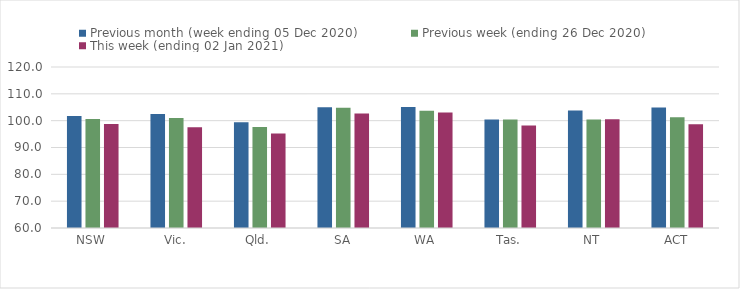
| Category | Previous month (week ending 05 Dec 2020) | Previous week (ending 26 Dec 2020) | This week (ending 02 Jan 2021) |
|---|---|---|---|
| NSW | 101.77 | 100.63 | 98.73 |
| Vic. | 102.46 | 100.96 | 97.59 |
| Qld. | 99.43 | 97.64 | 95.25 |
| SA | 104.97 | 104.85 | 102.71 |
| WA | 105.07 | 103.68 | 103.02 |
| Tas. | 100.4 | 100.42 | 98.23 |
| NT | 103.75 | 100.45 | 100.54 |
| ACT | 104.95 | 101.28 | 98.67 |